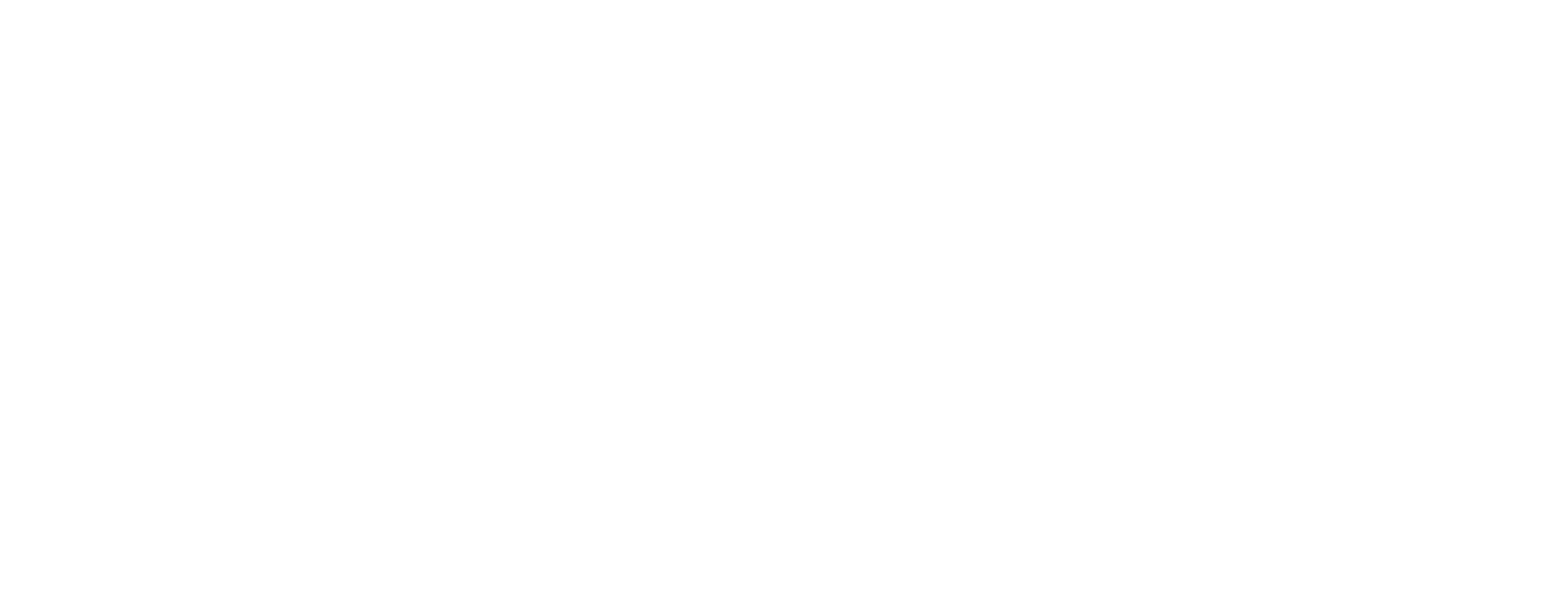
| Category | Series 0 | Series 1 |
|---|---|---|
| BRADFORD TEACHING HOSPITALS NHS FOUNDATION TRUST | 100 | 0 |
| RUSSELLS HALL HOSPITAL | 98.462 | 0 |
| ST GEORGE'S HOSPITAL (TOOTING) | 88.596 | 0 |
| KINGSTON HOSPITAL | 82.456 | 0 |
| MANCHESTER ROYAL INFIRMARY | 34.797 | 0 |
| ROYAL BOURNEMOUTH GENERAL HOSPITAL | 30.43 | 0 |
| ST HELENS HOSPITAL | 29.087 | 0 |
| THE TUNBRIDGE WELLS HOSPITAL | 21.231 | 0 |
| BRISTOL ROYAL INFIRMARY | 20.597 | 0 |
| NORTHERN LINCOLNSHIRE AND GOOLE NHS FOUNDATION TRUST | 20 | 0 |
| OXFORD UNIVERSITY HOSPITALS NHS FOUNDATION TRUST | 18.31 | 0 |
| ADDENBROOKE'S HOSPITAL | 17.991 | 0 |
| DERBY TEACHING HOSPITALS NHS FOUNDATION TRUST | 17.312 | 0 |
| ROYAL BLACKBURN HOSPITAL | 17.152 | 0 |
| THE JAMES COOK UNIVERSITY HOSPITAL | 16.285 | 0 |
| COUNTY DURHAM AND DARLINGTON NHS FOUNDATION TRUST | 13.689 | 0 |
| SANDWELL AND WEST BIRMINGHAM HOSPITALS NHS TRUST | 12.03 | 0 |
| SALFORD ROYAL | 11.959 | 0 |
| BUCKINGHAMSHIRE HEALTHCARE NHS TRUST | 10.933 | 0 |
| QUEEN'S HOSPITAL, BURTON UPON TRENT | 10.811 | 0 |
| BERKSHIRE HEALTHCARE NHS FOUNDATION TRUST | 10.586 | 0 |
| HEREFORD COUNTY HOSPITAL | 9.635 | 9.635 |
| ROYAL UNITED HOSPITAL | 9.358 | 0 |
| SOUTHAMPTON GENERAL HOSPITAL | 9.253 | 0 |
| CAMPUS FOR AGEING AND VITALITY | 9.146 | 0 |
| SALISBURY HEALTH CARE NHS TRUST | 8.582 | 0 |
| THE WHITTINGTON HOSPITAL | 8.18 | 0 |
| MUSGROVE PARK HOSPITAL | 7.923 | 0 |
| JAMES PAGET UNIVERSITY HOSPITAL | 7.852 | 0 |
| ST PETER'S HOSPITAL | 7.322 | 0 |
| SUNDERLAND ROYAL HOSPITAL | 7.098 | 0 |
| LEICESTER GENERAL HOSPITAL | 6.789 | 0 |
| ROYAL FREE HOSPITAL | 6.621 | 0 |
| HULL ROYAL INFIRMARY | 6.53 | 0 |
| WHIPPS CROSS UNIVERSITY HOSPITAL | 5.882 | 0 |
| PENNINE ACUTE HOSPITALS NHS TRUST | 5.464 | 0 |
| ST JAMES'S UNIVERSITY HOSPITAL | 5.36 | 0 |
| EAST AND NORTH HERTFORDSHIRE NHS TRUST | 4.799 | 0 |
| FRIMLEY PARK HOSPITAL | 3.837 | 0 |
| THE MAIDSTONE HOSPITAL | 2.976 | 0 |
| UNIVERSITY HOSPITAL (COVENTRY) | 1.786 | 0 |
| POOLE GENERAL HOSPITAL | 1.761 | 0 |